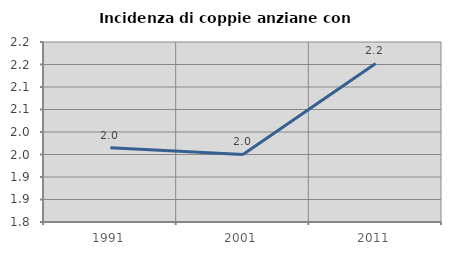
| Category | Incidenza di coppie anziane con figli |
|---|---|
| 1991.0 | 1.965 |
| 2001.0 | 1.95 |
| 2011.0 | 2.152 |